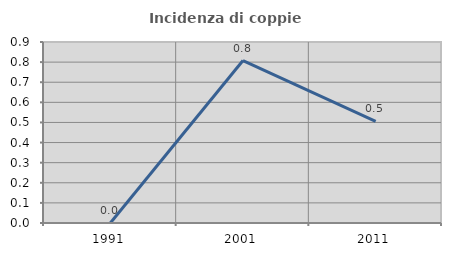
| Category | Incidenza di coppie miste |
|---|---|
| 1991.0 | 0 |
| 2001.0 | 0.808 |
| 2011.0 | 0.505 |